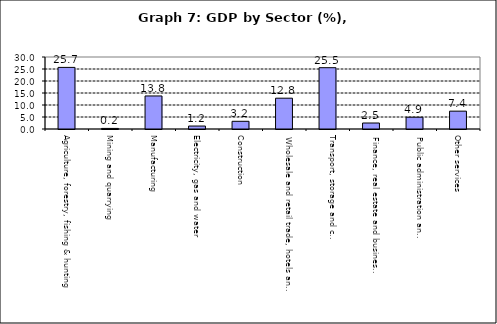
| Category | Series 0 |
|---|---|
| Agriculture, forestry, fishing & hunting | 25.667 |
| Mining and quarrying  | 0.246 |
| Manufacturing | 13.767 |
| Electricity, gas and water | 1.236 |
| Construction | 3.204 |
| Wholesale and retail trade, hotels and restaurants  | 12.837 |
| Transport, storage and communication                | 25.543 |
| Finance, real estate and business services          | 2.498 |
| Public administration and Defense                       | 4.905 |
| Other services                                    | 7.44 |